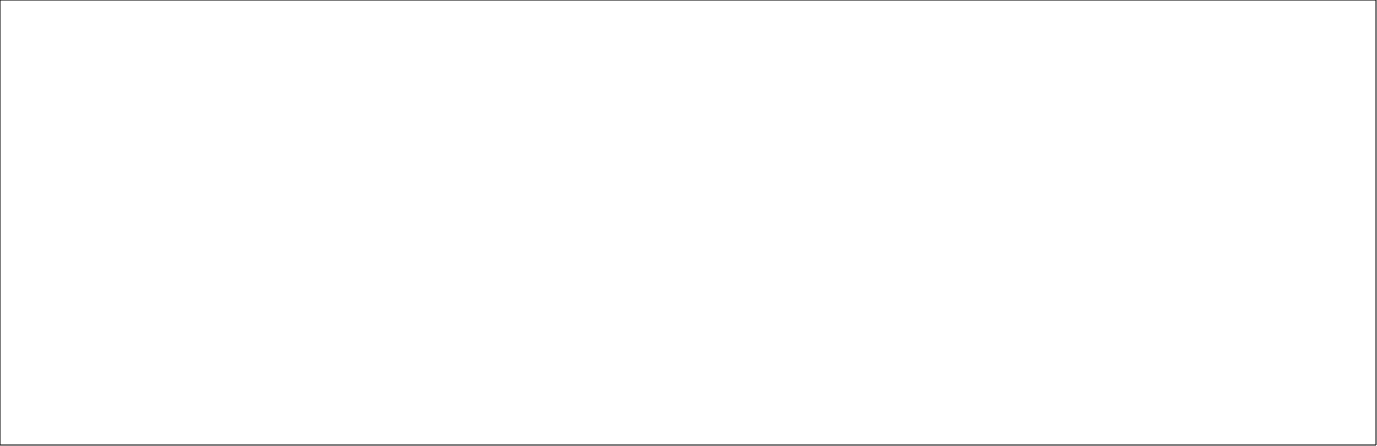
| Category | Sum of Mean |
|---|---|
| Adequate Experience | 81.08 |
| Clinical Supervision | 92.18 |
| Clinical Supervision out of hours | 88.54 |
| Curriculum Coverage | 75.19 |
| Educational Governance | 73.01 |
| Educational Supervision | 86.01 |
| Feedback | 80.85 |
| Handover | 69.79 |
| Induction | 80.82 |
| Local Teaching | 73.33 |
| Overall Satisfaction | 80.79 |
| Regional Teaching | 70.58 |
| Reporting systems | 72.92 |
| Rota Design | 66.67 |
| Study Leave | 62.28 |
| Supportive environment | 72.31 |
| Teamwork | 74.13 |
| Work Load | 53.95 |